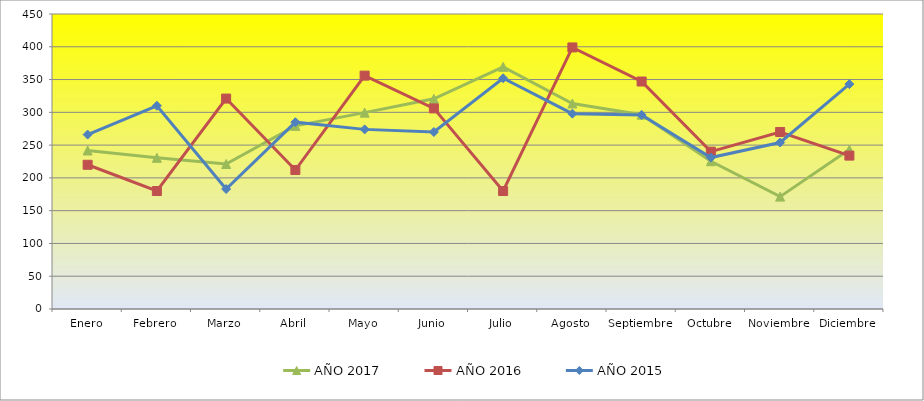
| Category | AÑO 2017 | AÑO 2016 | AÑO 2015 |
|---|---|---|---|
| Enero | 241.791 | 220 | 266 |
| Febrero | 230.597 | 180 | 310 |
| Marzo | 221.194 | 321 | 183 |
| Abril | 279.403 | 212 | 285 |
| Mayo | 299.552 | 356 | 274 |
| Junio | 320.597 | 306 | 270 |
| Julio | 369.403 | 180 | 352 |
| Agosto | 313.433 | 399 | 298 |
| Septiembre | 296.418 | 347 | 296 |
| Octubre | 225.429 | 240 | 231 |
| Noviembre | 171.429 | 270 | 254 |
| Diciembre | 243.134 | 234 | 343 |